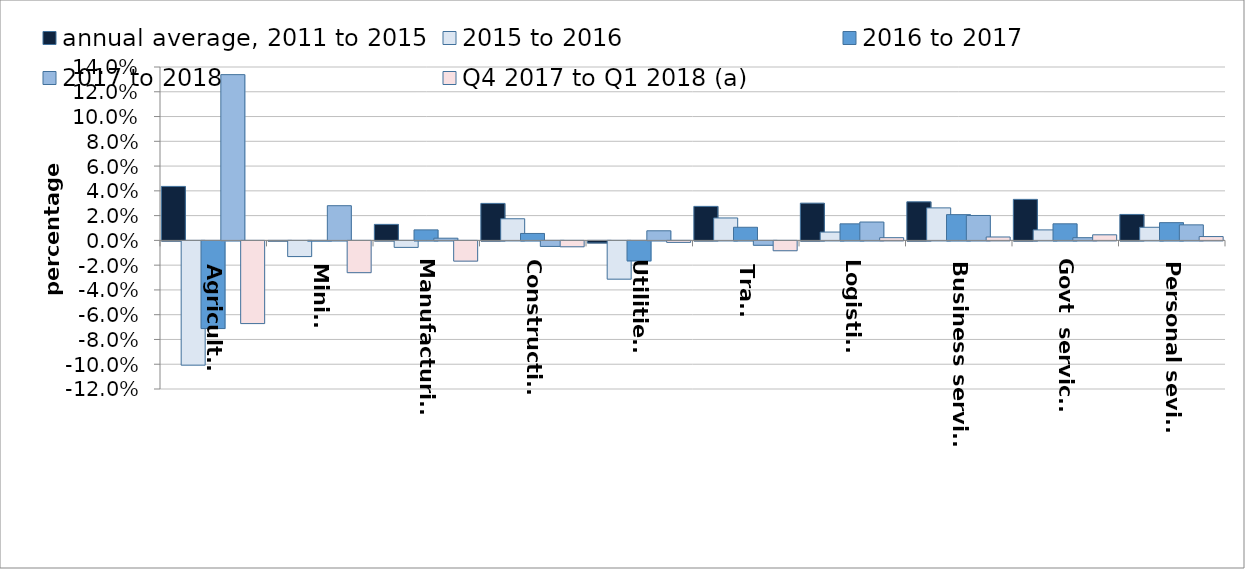
| Category | annual average, 2011 to 2015 | 2015 to 2016 | 2016 to 2017 | 2017 to 2018 | Q4 2017 to Q1 2018 (a) |
|---|---|---|---|---|---|
| Agriculture | 0.044 | -0.1 | -0.071 | 0.134 | -0.067 |
| Mining | 0 | -0.013 | 0 | 0.028 | -0.026 |
| Manufacturing | 0.013 | -0.005 | 0.008 | 0.002 | -0.016 |
| Construction | 0.03 | 0.017 | 0.006 | -0.004 | -0.005 |
| Utilities
 | -0.002 | -0.031 | -0.016 | 0.008 | -0.001 |
| Trade | 0.027 | 0.018 | 0.011 | -0.004 | -0.008 |
| Logistics | 0.03 | 0.007 | 0.013 | 0.015 | 0.002 |
| Business services | 0.031 | 0.026 | 0.021 | 0.02 | 0.003 |
| Govt  services | 0.033 | 0.008 | 0.013 | 0.002 | 0.005 |
| Personal sevices | 0.021 | 0.011 | 0.014 | 0.013 | 0.003 |